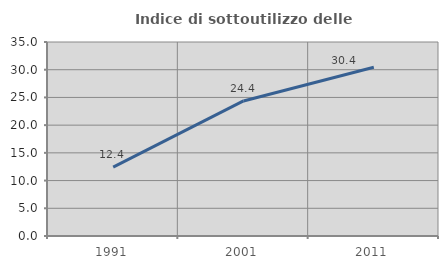
| Category | Indice di sottoutilizzo delle abitazioni  |
|---|---|
| 1991.0 | 12.418 |
| 2001.0 | 24.368 |
| 2011.0 | 30.435 |